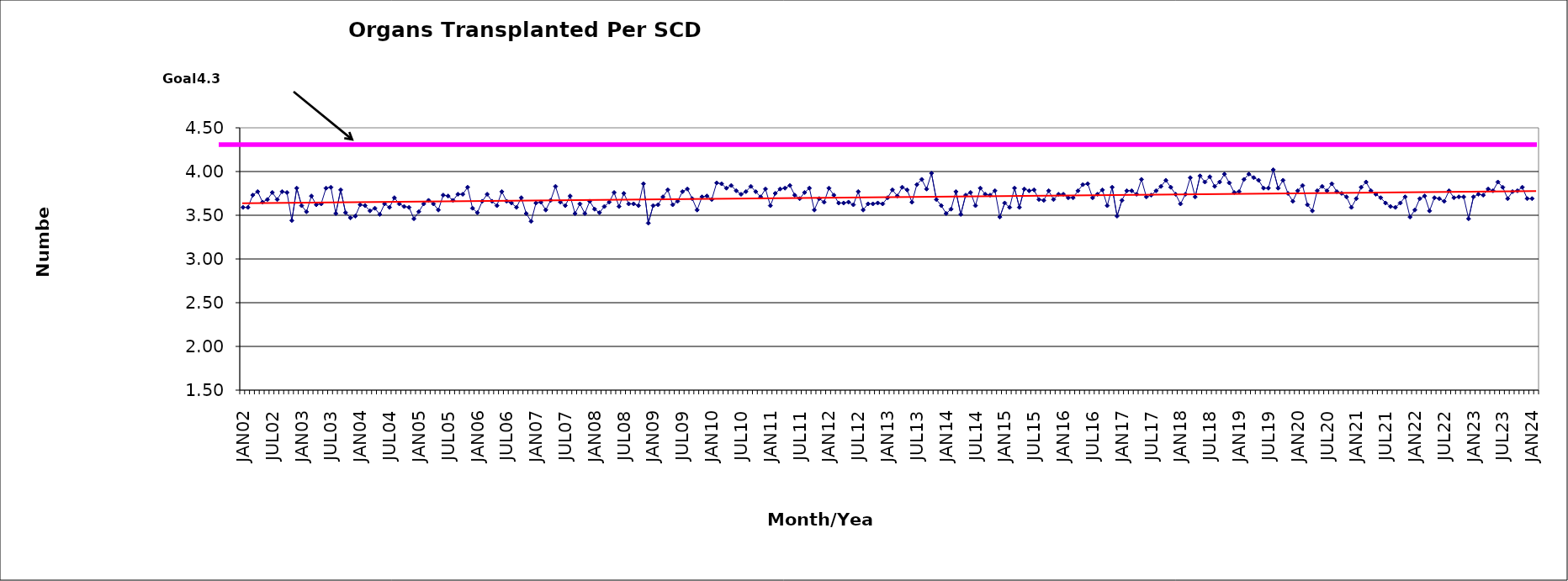
| Category | Series 0 |
|---|---|
| JAN02 | 3.59 |
| FEB02 | 3.59 |
| MAR02 | 3.73 |
| APR02 | 3.77 |
| MAY02 | 3.65 |
| JUN02 | 3.68 |
| JUL02 | 3.76 |
| AUG02 | 3.68 |
| SEP02 | 3.77 |
| OCT02 | 3.76 |
| NOV02 | 3.44 |
| DEC02 | 3.81 |
| JAN03 | 3.61 |
| FEB03 | 3.54 |
| MAR03 | 3.72 |
| APR03 | 3.62 |
| MAY03 | 3.63 |
| JUN03 | 3.81 |
| JUL03 | 3.82 |
| AUG03 | 3.52 |
| SEP03 | 3.79 |
| OCT03 | 3.53 |
| NOV03 | 3.47 |
| DEC03 | 3.49 |
| JAN04 | 3.62 |
| FEB04 | 3.61 |
| MAR04 | 3.55 |
| APR04 | 3.58 |
| MAY04 | 3.51 |
| JUN04 | 3.63 |
| JUL04 | 3.59 |
| AUG04 | 3.7 |
| SEP04 | 3.63 |
| OCT04 | 3.6 |
| NOV04 | 3.59 |
| DEC04 | 3.46 |
| JAN05 | 3.54 |
| FEB05 | 3.63 |
| MAR05 | 3.67 |
| APR05 | 3.63 |
| MAY05 | 3.56 |
| JUN05 | 3.73 |
| JUL05 | 3.72 |
| AUG05 | 3.67 |
| SEP05 | 3.74 |
| OCT05 | 3.74 |
| NOV05 | 3.82 |
| DEC05 | 3.58 |
| JAN06 | 3.53 |
| FEB06 | 3.66 |
| MAR06 | 3.74 |
| APR06 | 3.66 |
| MAY06 | 3.61 |
| JUN06 | 3.77 |
| JUL06 | 3.66 |
| AUG06 | 3.64 |
| SEP06 | 3.59 |
| OCT06 | 3.7 |
| NOV06 | 3.52 |
| DEC06 | 3.43 |
| JAN07 | 3.64 |
| FEB07 | 3.65 |
| MAR07 | 3.56 |
| APR07 | 3.67 |
| MAY07 | 3.83 |
| JUN07 | 3.65 |
| JUL07 | 3.61 |
| AUG07 | 3.72 |
| SEP07 | 3.52 |
| OCT07 | 3.63 |
| NOV07 | 3.52 |
| DEC07 | 3.66 |
| JAN08 | 3.57 |
| FEB08 | 3.53 |
| MAR08 | 3.6 |
| APR08 | 3.65 |
| MAY08 | 3.76 |
| JUN08 | 3.6 |
| JUL08 | 3.75 |
| AUG08 | 3.63 |
| SEP08 | 3.63 |
| OCT08 | 3.61 |
| NOV08 | 3.86 |
| DEC08 | 3.41 |
| JAN09 | 3.61 |
| FEB09 | 3.62 |
| MAR09 | 3.71 |
| APR09 | 3.79 |
| MAY09 | 3.62 |
| JUN09 | 3.66 |
| JUL09 | 3.77 |
| AUG09 | 3.8 |
| SEP09 | 3.69 |
| OCT09 | 3.56 |
| NOV09 | 3.71 |
| DEC09 | 3.72 |
| JAN10 | 3.68 |
| FEB10 | 3.87 |
| MAR10 | 3.86 |
| APR10 | 3.81 |
| MAY10 | 3.84 |
| JUN10 | 3.78 |
| JUL10 | 3.74 |
| AUG10 | 3.77 |
| SEP10 | 3.83 |
| OCT10 | 3.77 |
| NOV10 | 3.71 |
| DEC10 | 3.8 |
| JAN11 | 3.61 |
| FEB11 | 3.75 |
| MAR11 | 3.8 |
| APR11 | 3.81 |
| MAY11 | 3.84 |
| JUN11 | 3.73 |
| JUL11 | 3.69 |
| AUG11 | 3.76 |
| SEP11 | 3.81 |
| OCT11 | 3.56 |
| NOV11 | 3.69 |
| DEC11 | 3.65 |
| JAN12 | 3.81 |
| FEB12 | 3.73 |
| MAR12 | 3.64 |
| APR12 | 3.64 |
| MAY12 | 3.65 |
| JUN12 | 3.62 |
| JUL12 | 3.77 |
| AUG12 | 3.56 |
| SEP12 | 3.63 |
| OCT12 | 3.63 |
| NOV12 | 3.64 |
| DEC12 | 3.63 |
| JAN13 | 3.7 |
| FEB13 | 3.79 |
| MAR13 | 3.72 |
| APR13 | 3.82 |
| MAY13 | 3.79 |
| JUN13 | 3.65 |
| JUL13 | 3.85 |
| AUG13 | 3.91 |
| SEP13 | 3.8 |
| OCT13 | 3.98 |
| NOV13 | 3.68 |
| DEC13 | 3.61 |
| JAN14 | 3.52 |
| FEB14 | 3.57 |
| MAR14 | 3.77 |
| APR14 | 3.51 |
| MAY14 | 3.73 |
| JUN14 | 3.76 |
| JUL14 | 3.61 |
| AUG14 | 3.81 |
| SEP14 | 3.74 |
| OCT14 | 3.73 |
| NOV14 | 3.78 |
| DEC14 | 3.48 |
| JAN15 | 3.64 |
| FEB15 | 3.59 |
| MAR15 | 3.81 |
| APR15 | 3.59 |
| MAY15 | 3.8 |
| JUN15 | 3.78 |
| JUL15 | 3.79 |
| AUG15 | 3.68 |
| SEP15 | 3.67 |
| OCT15 | 3.78 |
| NOV15 | 3.68 |
| DEC15 | 3.74 |
| JAN16 | 3.74 |
| FEB16 | 3.7 |
| MAR16 | 3.7 |
| APR16 | 3.78 |
| MAY16 | 3.85 |
| JUN16 | 3.86 |
| JUL16 | 3.7 |
| AUG16 | 3.74 |
| SEP16 | 3.79 |
| OCT16 | 3.61 |
| NOV16 | 3.82 |
| DEC16 | 3.49 |
| JAN17 | 3.67 |
| FEB17 | 3.78 |
| MAR17 | 3.78 |
| APR17 | 3.74 |
| MAY17 | 3.91 |
| JUN17 | 3.71 |
| JUL17 | 3.73 |
| AUG17 | 3.78 |
| SEP17 | 3.83 |
| OCT17 | 3.9 |
| NOV17 | 3.82 |
| DEC17 | 3.74 |
| JAN18 | 3.63 |
| FEB18 | 3.74 |
| MAR18 | 3.93 |
| APR18 | 3.71 |
| MAY18 | 3.95 |
| JUN18 | 3.88 |
| JUL18 | 3.94 |
| AUG18 | 3.83 |
| SEP18 | 3.88 |
| OCT18 | 3.97 |
| NOV18 | 3.87 |
| DEC18 | 3.76 |
| JAN19 | 3.77 |
| FEB19 | 3.91 |
| MAR19 | 3.97 |
| APR19 | 3.93 |
| MAY19 | 3.9 |
| JUN19 | 3.81 |
| JUL19 | 3.81 |
| AUG19 | 4.02 |
| SEP19 | 3.81 |
| OCT19 | 3.9 |
| NOV19 | 3.75 |
| DEC19 | 3.66 |
| JAN20 | 3.78 |
| FEB20 | 3.84 |
| MAR20 | 3.62 |
| APR20 | 3.55 |
| MAY20 | 3.78 |
| JUN20 | 3.83 |
| JUL20 | 3.78 |
| AUG20 | 3.86 |
| SEP20 | 3.77 |
| OCT20 | 3.75 |
| NOV20 | 3.71 |
| DEC20 | 3.59 |
| JAN21 | 3.69 |
| FEB21 | 3.82 |
| MAR21 | 3.88 |
| APR21 | 3.78 |
| MAY21 | 3.74 |
| JUN21 | 3.7 |
| JUL21 | 3.64 |
| AUG21 | 3.6 |
| SEP21 | 3.59 |
| OCT21 | 3.64 |
| NOV21 | 3.71 |
| DEC21 | 3.48 |
| JAN22 | 3.56 |
| FEB22 | 3.69 |
| MAR22 | 3.72 |
| APR22 | 3.55 |
| MAY22 | 3.7 |
| JUN22 | 3.69 |
| JUL22 | 3.66 |
| AUG22 | 3.78 |
| SEP22 | 3.7 |
| OCT22 | 3.71 |
| NOV22 | 3.71 |
| DEC22 | 3.46 |
| JAN23 | 3.71 |
| FEB23 | 3.74 |
| MAR23 | 3.73 |
| APR23 | 3.8 |
| MAY23 | 3.78 |
| JUN23 | 3.88 |
| JUL23 | 3.82 |
| AUG23 | 3.69 |
| SEP23 | 3.77 |
| OCT23 | 3.78 |
| NOV23 | 3.82 |
| DEC23 | 3.69 |
| JAN24 | 3.69 |